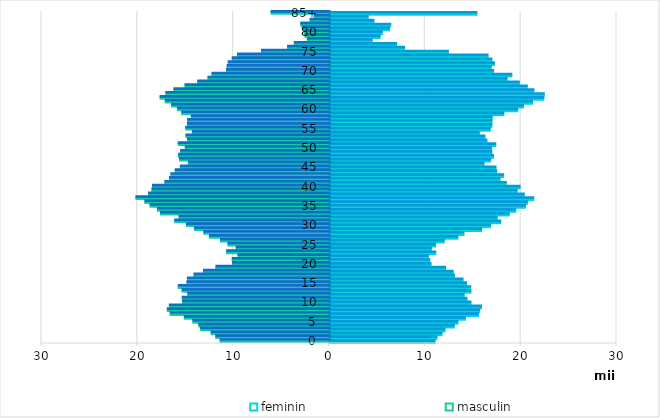
| Category | feminin | masculin |
|---|---|---|
| 0 | 10957 | -11369 |
| 1 | 11156 | -11821 |
| 2 | 11681 | -12299 |
| 3 | 12002 | -13393 |
| 4 | 12969 | -13596 |
| 5 | 13352 | -14216 |
| 6 | 14125 | -15099 |
| 7 | 15502 | -16579 |
| 8 | 15617 | -16873 |
| 9 | 15807 | -16663 |
| 10 | 14707 | -15286 |
| 11 | 14288 | -15316 |
| 12 | 13995 | -14741 |
| 13 | 14701 | -15329 |
| 14 | 14678 | -15731 |
| 15 | 14252 | -14827 |
| 16 | 13878 | -14775 |
| 17 | 12992 | -14092 |
| 18 | 12855 | -13094 |
| 19 | 12052 | -11806 |
| 20 | 10537 | -10073 |
| 21 | 10412 | -10102 |
| 22 | 10262 | -9502 |
| 23 | 11038 | -10681 |
| 24 | 10582 | -9688 |
| 25 | 11015 | -10548 |
| 26 | 11921 | -11320 |
| 27 | 13352 | -12484 |
| 28 | 13987 | -13078 |
| 29 | 15819 | -14049 |
| 30 | 16741 | -14870 |
| 31 | 17816 | -16106 |
| 32 | 17437 | -15655 |
| 33 | 18705 | -17584 |
| 34 | 19378 | -17895 |
| 35 | 20393 | -18673 |
| 36 | 20597 | -19217 |
| 37 | 21258 | -20151 |
| 38 | 20276 | -18838 |
| 39 | 19527 | -18478 |
| 40 | 19839 | -18418 |
| 41 | 18402 | -17137 |
| 42 | 17753 | -16650 |
| 43 | 18119 | -16510 |
| 44 | 17392 | -16054 |
| 45 | 17321 | -15515 |
| 46 | 16069 | -14670 |
| 47 | 16762 | -15599 |
| 48 | 17056 | -15700 |
| 49 | 16876 | -15486 |
| 50 | 16863 | -15007 |
| 51 | 17296 | -15735 |
| 52 | 16372 | -14761 |
| 53 | 16163 | -14931 |
| 54 | 15578 | -14261 |
| 55 | 16727 | -14955 |
| 56 | 16889 | -14767 |
| 57 | 16895 | -14763 |
| 58 | 16919 | -14368 |
| 59 | 18140 | -15369 |
| 60 | 19591 | -15817 |
| 61 | 20197 | -16429 |
| 62 | 21131 | -17079 |
| 63 | 22310 | -17627 |
| 64 | 22363 | -17034 |
| 65 | 21277 | -16190 |
| 66 | 20590 | -15031 |
| 67 | 19754 | -13706 |
| 68 | 18480 | -12631 |
| 69 | 18976 | -12218 |
| 70 | 17073 | -10700 |
| 71 | 16824 | -10634 |
| 72 | 17159 | -10519 |
| 73 | 16897 | -10101 |
| 74 | 16493 | -9548 |
| 75 | 12357 | -7044 |
| 76 | 7783 | -4324 |
| 77 | 6952 | -3629 |
| 78 | 4398 | -2256 |
| 79 | 5231 | -2503 |
| 80 | 5461 | -2590 |
| 81 | 6209 | -2801 |
| 82 | 6341 | -2955 |
| 83 | 4584 | -1974 |
| 84 | 3986 | -1545 |
| 85+ | 15331 | -6051 |